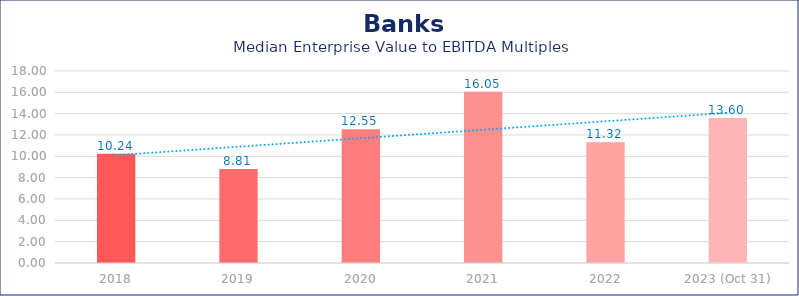
| Category | Banks |
|---|---|
| 2018 | 10.24 |
| 2019 | 8.81 |
| 2020 | 12.55 |
| 2021 | 16.05 |
| 2022 | 11.32 |
| 2023 (Oct 31) | 13.6 |